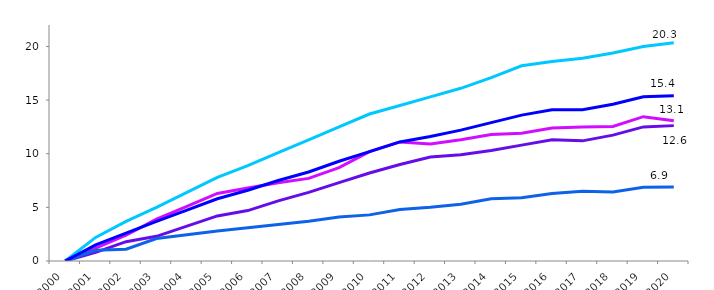
| Category | Collèges | LEGT | LP | Cités scolaires | Ensemble |
|---|---|---|---|---|---|
| 2000.0 | 0 | 0 | 0 | 0 | 0 |
| 2001.0 | 2.2 | 0.8 | 1.2 | 1 | 1.5 |
| 2002.0 | 3.7 | 1.8 | 2.4 | 1.1 | 2.6 |
| 2003.0 | 5 | 2.3 | 3.9 | 2.1 | 3.7 |
| 2004.0 | 6.4 | 3.25 | 5.1 | 2.45 | 4.75 |
| 2005.0 | 7.8 | 4.2 | 6.3 | 2.8 | 5.8 |
| 2006.0 | 8.9 | 4.7 | 6.8 | 3.1 | 6.6 |
| 2007.0 | 10.1 | 5.6 | 7.3 | 3.4 | 7.5 |
| 2008.0 | 11.3 | 6.4 | 7.7 | 3.7 | 8.3 |
| 2009.0 | 12.5 | 7.3 | 8.7 | 4.1 | 9.3 |
| 2010.0 | 13.7 | 8.2 | 10.2 | 4.3 | 10.2 |
| 2011.0 | 14.5 | 9 | 11.1 | 4.8 | 11.1 |
| 2012.0 | 15.3 | 9.7 | 10.9 | 5 | 11.6 |
| 2013.0 | 16.1 | 9.9 | 11.3 | 5.3 | 12.2 |
| 2014.0 | 17.1 | 10.3 | 11.8 | 5.8 | 12.9 |
| 2015.0 | 18.2 | 10.8 | 11.9 | 5.9 | 13.6 |
| 2016.0 | 18.6 | 11.3 | 12.4 | 6.3 | 14.1 |
| 2017.0 | 18.9 | 11.2 | 12.5 | 6.5 | 14.1 |
| 2018.0 | 19.389 | 11.736 | 12.534 | 6.441 | 14.616 |
| 2019.0 | 19.994 | 12.501 | 13.455 | 6.864 | 15.317 |
| 2020.0 | 20.347 | 12.62 | 13.084 | 6.895 | 15.412 |